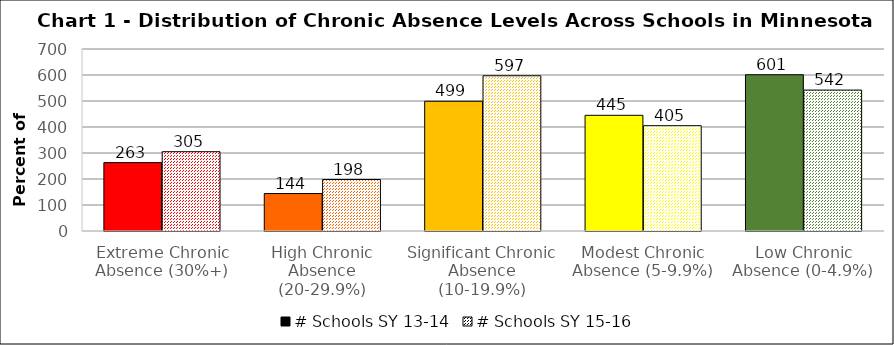
| Category | # Schools SY 13-14 | # Schools SY 15-16 |
|---|---|---|
| Extreme Chronic Absence (30%+) | 263 | 305 |
| High Chronic Absence (20-29.9%) | 144 | 198 |
| Significant Chronic Absence (10-19.9%) | 499 | 597 |
| Modest Chronic Absence (5-9.9%) | 445 | 405 |
| Low Chronic Absence (0-4.9%) | 601 | 542 |